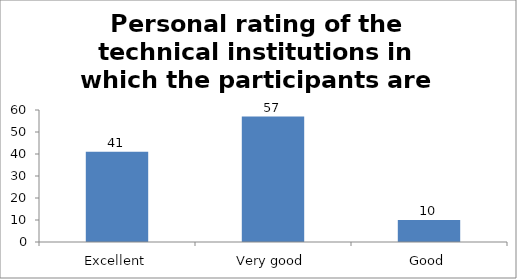
| Category | Personal rating of the technical institutions in which the participants are employed |
|---|---|
| Excellent | 41 |
| Very good | 57 |
| Good | 10 |